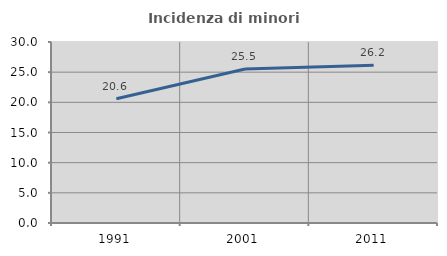
| Category | Incidenza di minori stranieri |
|---|---|
| 1991.0 | 20.588 |
| 2001.0 | 25.517 |
| 2011.0 | 26.163 |